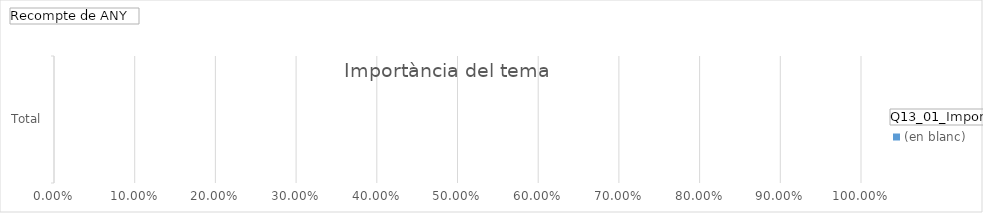
| Category | (en blanc) |
|---|---|
| Total | 0 |